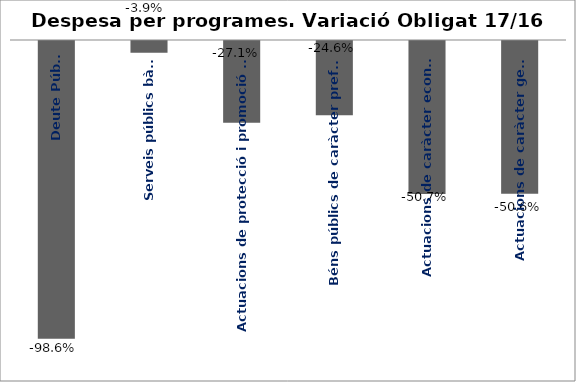
| Category | Series 0 |
|---|---|
| Deute Públic | -0.986 |
| Serveis públics bàsics | -0.039 |
| Actuacions de protecció i promoció social | -0.271 |
| Béns públics de caràcter preferent | -0.246 |
| Actuacions de caràcter econòmic | -0.507 |
| Actuacions de caràcter general | -0.506 |